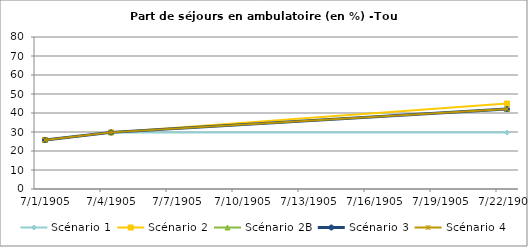
| Category | Scénario 1 | Scénario 2 | Scénario 2B | Scénario 3 | Scénario 4 |
|---|---|---|---|---|---|
| 2009.0 | 25.812 | 25.812 | 25.812 | 25.812 | 25.812 |
| 2012.0 | 29.802 | 29.802 | 29.802 | 29.802 | 29.802 |
| 2030.0 | 29.714 | 45.006 | 42.094 | 42.094 | 42.094 |